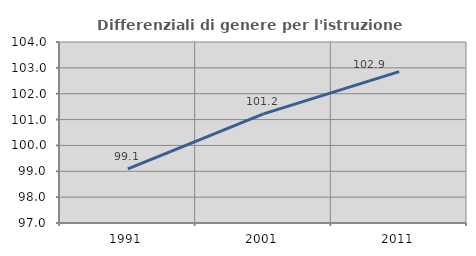
| Category | Differenziali di genere per l'istruzione superiore |
|---|---|
| 1991.0 | 99.092 |
| 2001.0 | 101.221 |
| 2011.0 | 102.854 |